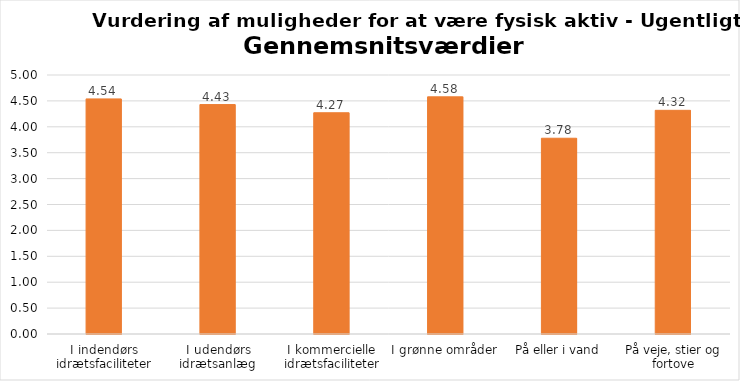
| Category | Gennemsnit |
|---|---|
| I indendørs idrætsfaciliteter | 4.538 |
| I udendørs idrætsanlæg | 4.429 |
| I kommercielle idrætsfaciliteter | 4.271 |
| I grønne områder | 4.579 |
| På eller i vand | 3.779 |
| På veje, stier og fortove | 4.318 |